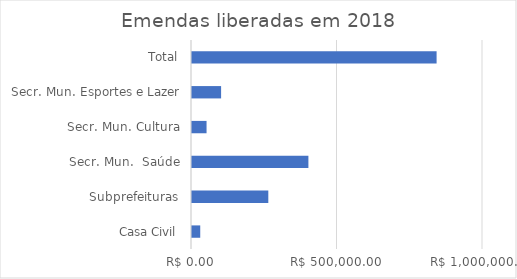
| Category | Valor |
|---|---|
| Casa Civil | 28300 |
| Subprefeituras | 262236.86 |
| Secr. Mun.  Saúde | 400000 |
| Secr. Mun. Cultura | 50000 |
| Secr. Mun. Esportes e Lazer | 100000 |
| Total | 840536.86 |